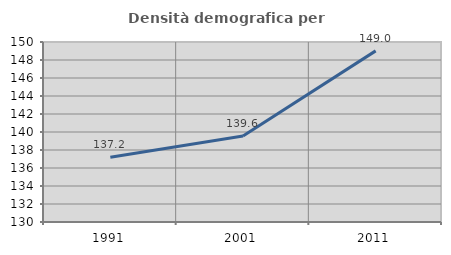
| Category | Densità demografica |
|---|---|
| 1991.0 | 137.187 |
| 2001.0 | 139.552 |
| 2011.0 | 149.013 |